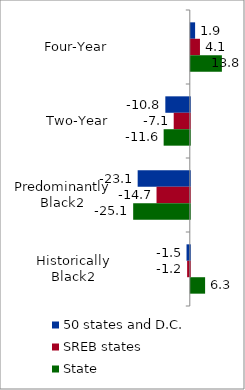
| Category | 50 states and D.C. | SREB states | State |
|---|---|---|---|
| Four-Year | 1.905 | 4.055 | 13.756 |
| Two-Year | -10.829 | -7.122 | -11.573 |
| Predominantly Black2 | -23.068 | -14.719 | -25.053 |
| Historically Black2 | -1.45 | -1.182 | 6.329 |